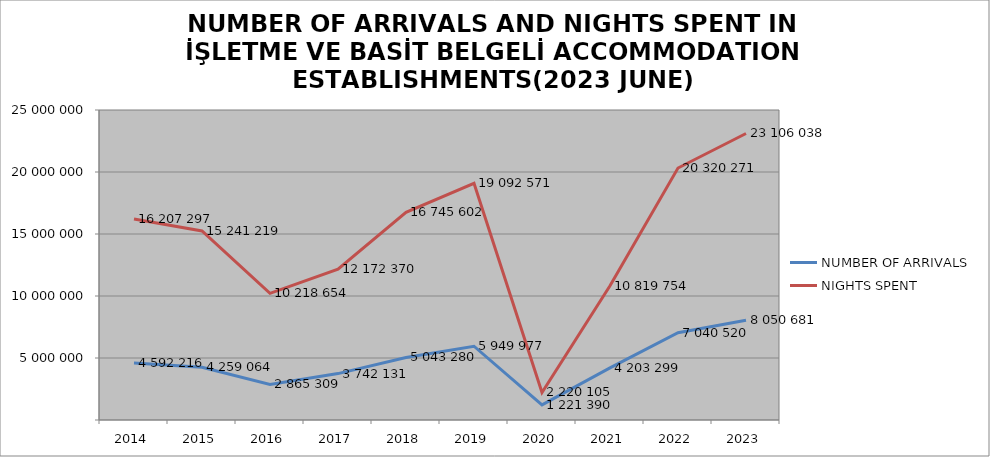
| Category | NUMBER OF ARRIVALS | NIGHTS SPENT |
|---|---|---|
| 2014 | 4592216 | 16207297 |
| 2015 | 4259064 | 15241219 |
| 2016 | 2865309 | 10218654 |
| 2017 | 3742131 | 12172370 |
| 2018 | 5043280 | 16745602 |
| 2019 | 5949977 | 19092571 |
| 2020 | 1221390 | 2220105 |
| 2021 | 4203299 | 10819754 |
| 2022 | 7040520 | 20320271 |
| 2023 | 8050681 | 23106038 |